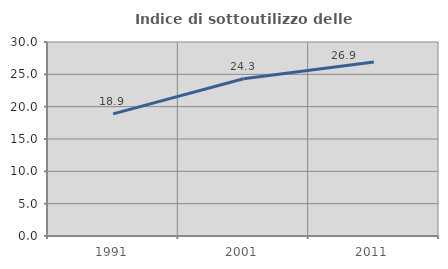
| Category | Indice di sottoutilizzo delle abitazioni  |
|---|---|
| 1991.0 | 18.881 |
| 2001.0 | 24.324 |
| 2011.0 | 26.904 |